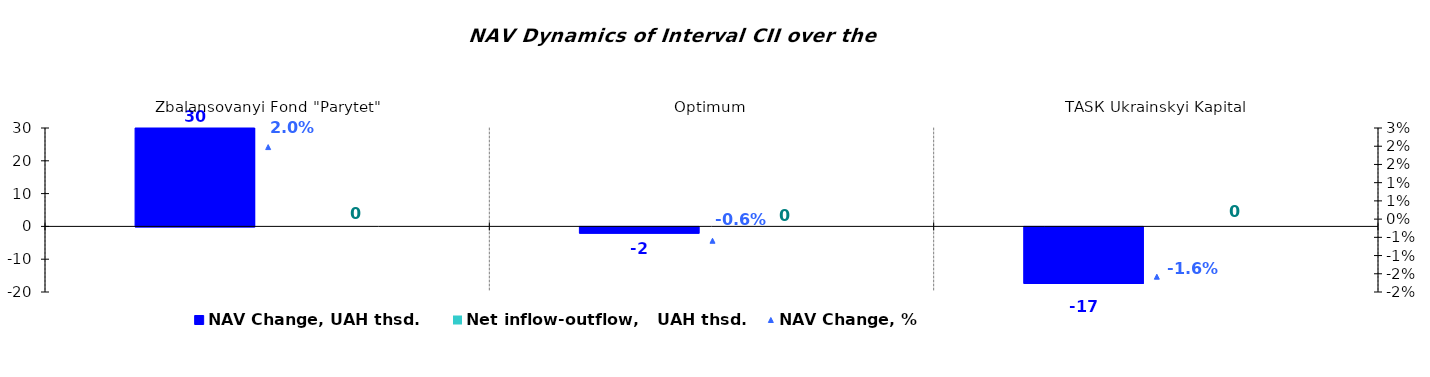
| Category | NAV Change, UAH thsd. | Net inflow-outflow,   UAH thsd. |
|---|---|---|
| Zbalansovanyi Fond "Parytet" | 30.321 | 0 |
| Оptimum | -1.926 | 0 |
| ТАSК Ukrainskyi Kapital | -17.221 | 0 |